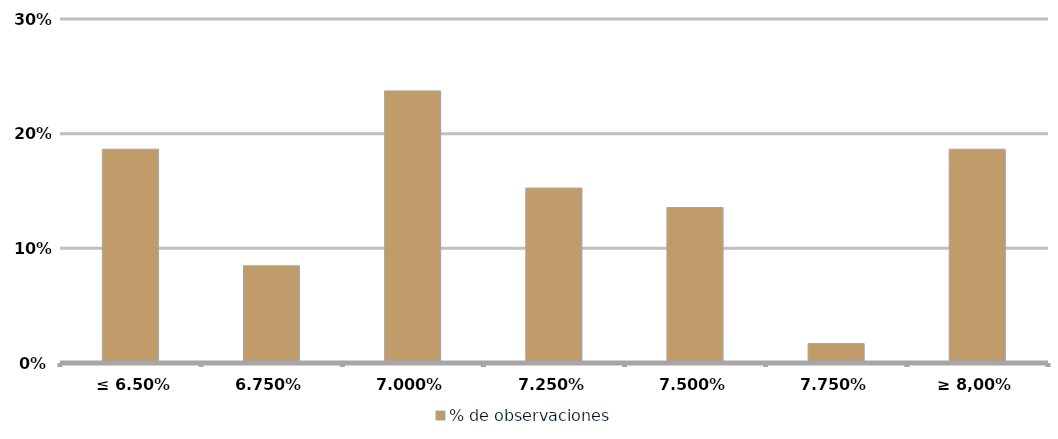
| Category | % de observaciones  |
|---|---|
|  ≤ 6.50% | 0.186 |
| 6,75% | 0.085 |
| 7,00% | 0.237 |
| 7,25% | 0.153 |
| 7,50% | 0.136 |
| 7,75% | 0.017 |
| ≥ 8,00% | 0.186 |